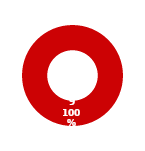
| Category | ASSET |
|---|---|
| MIL 3 Complete | 0 |
| MIL 3 Not Complete | 9 |